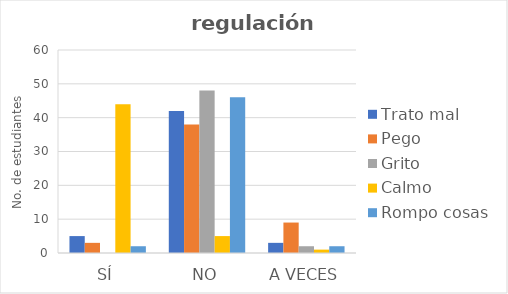
| Category | Trato mal | Pego | Grito | Calmo | Rompo cosas |
|---|---|---|---|---|---|
| Sí | 5 | 3 | 0 | 44 | 2 |
| No | 42 | 38 | 48 | 5 | 46 |
| A veces | 3 | 9 | 2 | 1 | 2 |